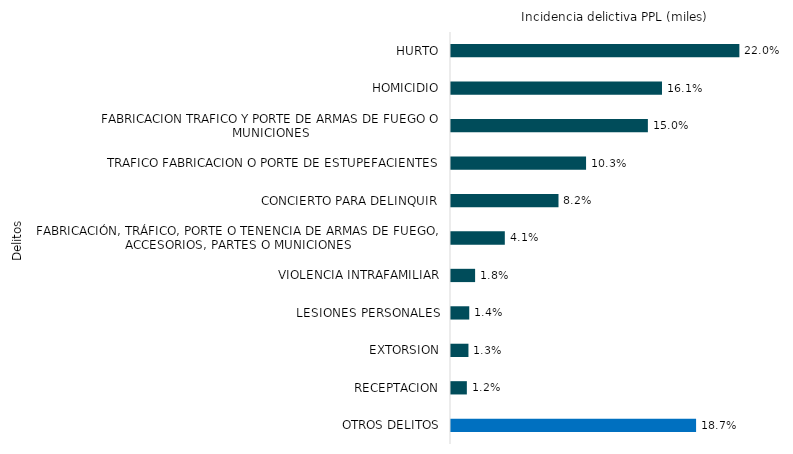
| Category | Series 0 |
|---|---|
| HURTO | 2165 |
| HOMICIDIO | 1584 |
| FABRICACION TRAFICO Y PORTE DE ARMAS DE FUEGO O MUNICIONES | 1478 |
| TRAFICO FABRICACION O PORTE DE ESTUPEFACIENTES | 1014 |
| CONCIERTO PARA DELINQUIR | 807 |
| FABRICACIÓN, TRÁFICO, PORTE O TENENCIA DE ARMAS DE FUEGO, ACCESORIOS, PARTES O MUNICIONES | 404 |
| VIOLENCIA INTRAFAMILIAR | 181 |
| LESIONES PERSONALES | 137 |
| EXTORSION | 131 |
| RECEPTACION | 119 |
| OTROS DELITOS | 1840 |